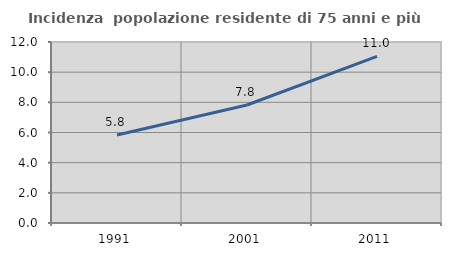
| Category | Incidenza  popolazione residente di 75 anni e più |
|---|---|
| 1991.0 | 5.832 |
| 2001.0 | 7.825 |
| 2011.0 | 11.049 |